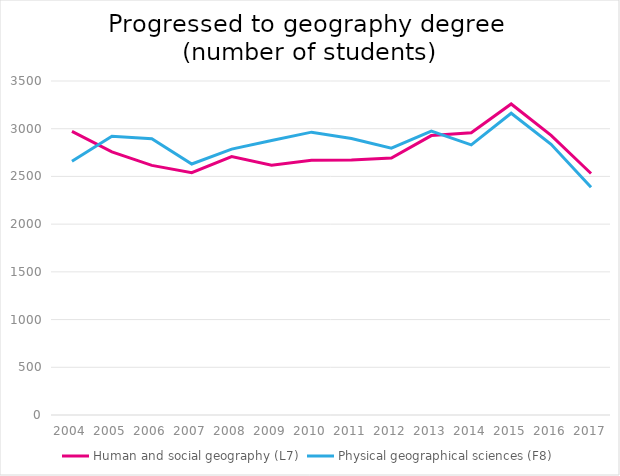
| Category | Human and social geography (L7) | Physical geographical sciences (F8) |
|---|---|---|
| 2004.0 | 2972 | 2659 |
| 2005.0 | 2757 | 2920 |
| 2006.0 | 2616 | 2896 |
| 2007.0 | 2539 | 2630 |
| 2008.0 | 2708 | 2786 |
| 2009.0 | 2618 | 2876 |
| 2010.0 | 2670 | 2964 |
| 2011.0 | 2671 | 2898 |
| 2012.0 | 2693 | 2796 |
| 2013.0 | 2928 | 2974 |
| 2014.0 | 2957 | 2830 |
| 2015.0 | 3259 | 3162 |
| 2016.0 | 2931 | 2837 |
| 2017.0 | 2531 | 2386 |